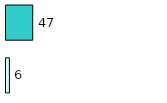
| Category | Series 0 | Series 1 |
|---|---|---|
| 0 | 6 | 47 |